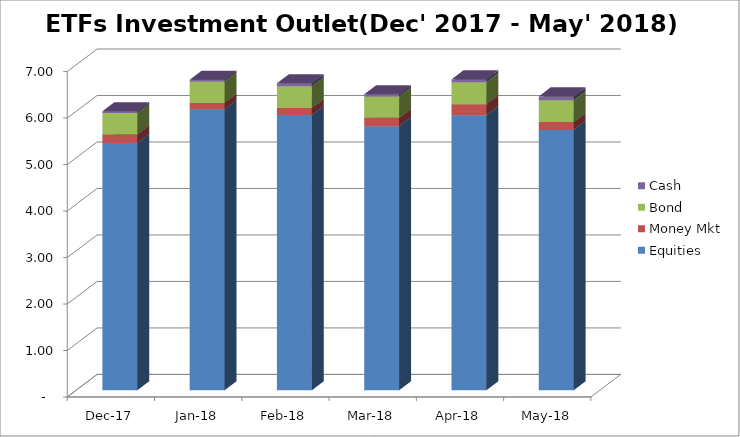
| Category | Equities | Money Mkt | Bond | Cash |
|---|---|---|---|---|
| 2017-12-01 | 5320268313.37 | 180659120.85 | 461893095.23 | 38551656.85 |
| 2018-01-01 | 6042563240.56 | 136904370.35 | 461893095.23 | 38893765.13 |
| 2018-02-01 | 5921870729.43 | 151252495.1 | 464176980.34 | 64897422.63 |
| 2018-03-01 | 5680580702.11 | 178223610.44 | 461242108.34 | 47114040.72 |
| 2018-04-01 | 5916812401.32 | 236436196.19 | 473183326.33 | 59989270.56 |
| 2018-05-01 | 5604937403.21 | 163325823.53 | 470433442.99 | 82279978.28 |